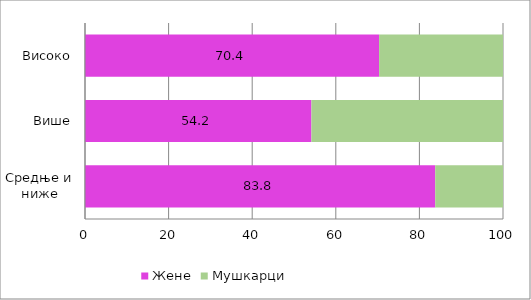
| Category | Жене | Мушкарци |
|---|---|---|
| Средње и ниже | 83.784 | 16.216 |
| Више | 54.167 | 45.833 |
| Високо | 70.358 | 29.642 |